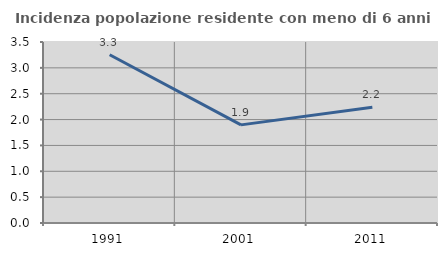
| Category | Incidenza popolazione residente con meno di 6 anni |
|---|---|
| 1991.0 | 3.253 |
| 2001.0 | 1.898 |
| 2011.0 | 2.237 |